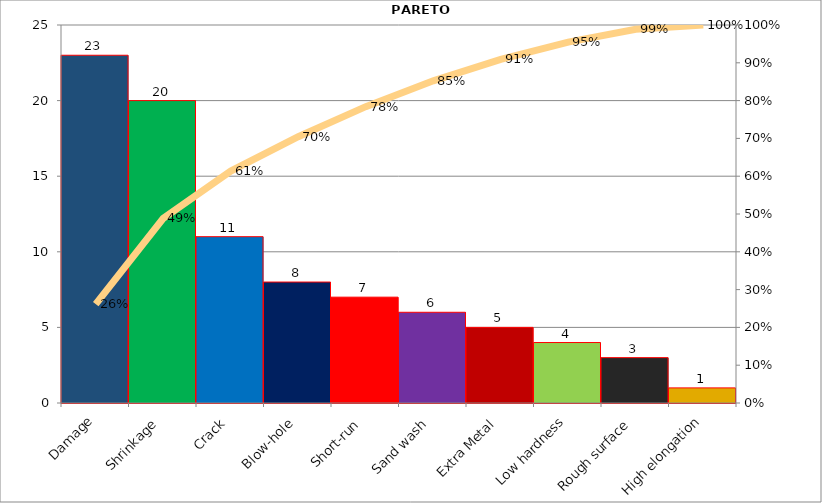
| Category | Quantity |
|---|---|
| Damage | 23 |
| Shrinkage | 20 |
| Crack | 11 |
| Blow-hole | 8 |
| Short-run | 7 |
| Sand wash | 6 |
| Extra Metal | 5 |
| Low hardness | 4 |
| Rough surface | 3 |
| High elongation | 1 |